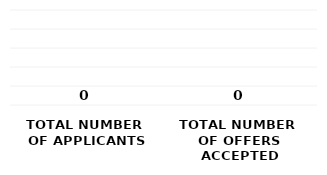
| Category | Series 0 |
|---|---|
| TOTAL NUMBER 
OF APPLICANTS | 0 |
| TOTAL NUMBER 
OF OFFERS ACCEPTED | 0 |